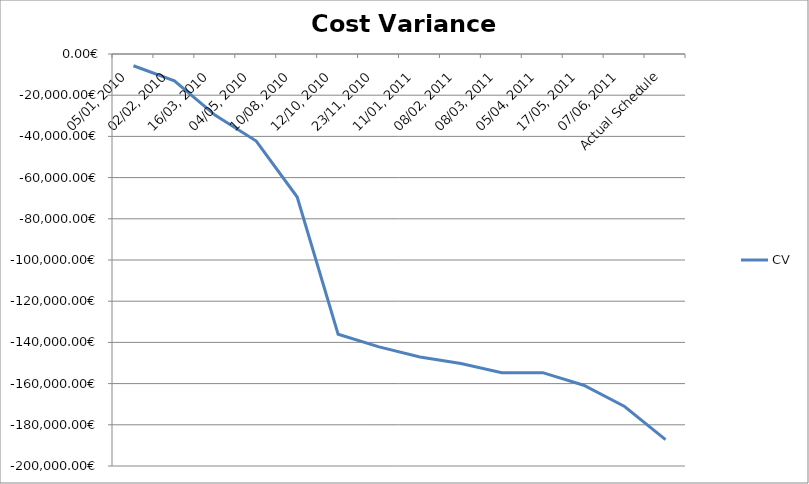
| Category | CV |
|---|---|
| 05/01, 2010 | -5712.685 |
| 02/02, 2010 | -12991.066 |
| 16/03, 2010 | -29749.699 |
| 04/05, 2010 | -42274.799 |
| 10/08, 2010 | -69436.801 |
| 12/10, 2010 | -136030.399 |
| 23/11, 2010 | -142170.799 |
| 11/01, 2011 | -147056.073 |
| 08/02, 2011 | -150205.499 |
| 08/03, 2011 | -154697.999 |
| 05/04, 2011 | -154697.999 |
| 17/05, 2011 | -160807.278 |
| 07/06, 2011 | -171128.799 |
| Actual Schedule | -187159.999 |